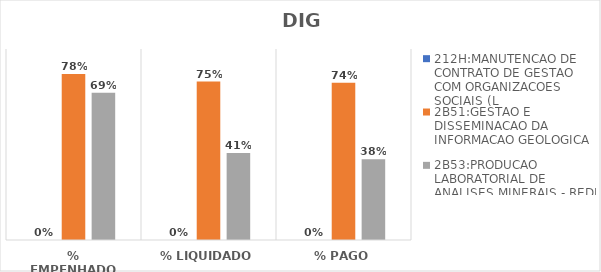
| Category | 212H:MANUTENCAO DE CONTRATO DE GESTAO COM ORGANIZACOES SOCIAIS (L | 2B51:GESTAO E DISSEMINACAO DA INFORMACAO GEOLOGICA | 2B53:PRODUCAO LABORATORIAL DE ANALISES MINERAIS - REDE LAMIN |
|---|---|---|---|
| % EMPENHADO | 0 | 0.782 | 0.694 |
| % LIQUIDADO | 0 | 0.746 | 0.41 |
| % PAGO | 0 | 0.741 | 0.381 |